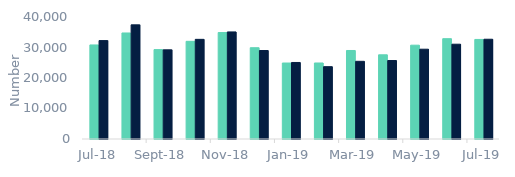
| Category | First-time
buyers | Home movers |
|---|---|---|
| 2018-07-01 | 30840 | 32260 |
| 2018-08-01 | 34760 | 37420 |
| 2018-09-01 | 29310 | 29230 |
| 2018-10-01 | 32020 | 32670 |
| 2018-11-01 | 34900 | 35110 |
| 2018-12-01 | 29930 | 29010 |
| 2019-01-01 | 24910 | 25090 |
| 2019-02-01 | 24920 | 23710 |
| 2019-03-01 | 29020 | 25470 |
| 2019-04-01 | 27600 | 25730 |
| 2019-05-01 | 30760 | 29440 |
| 2019-06-01 | 32890 | 31080 |
| 2019-07-01 | 32640 | 32710 |